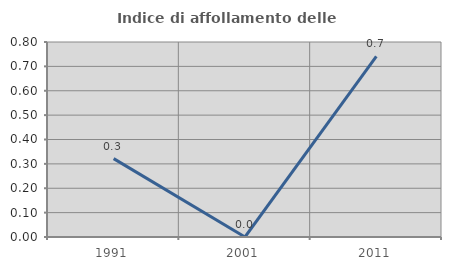
| Category | Indice di affollamento delle abitazioni  |
|---|---|
| 1991.0 | 0.322 |
| 2001.0 | 0 |
| 2011.0 | 0.741 |